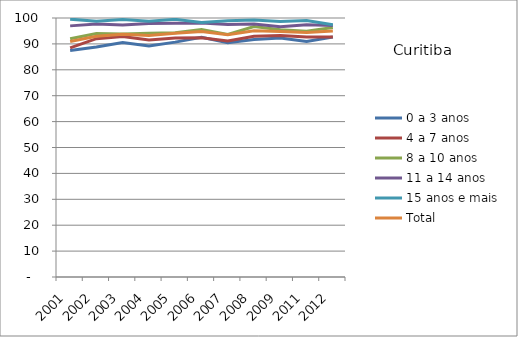
| Category | 0 a 3 anos | 4 a 7 anos | 8 a 10 anos | 11 a 14 anos | 15 anos e mais | Total |
|---|---|---|---|---|---|---|
| 2001.0 | 87.42 | 88.47 | 91.96 | 96.96 | 99.56 | 90.9 |
| 2002.0 | 88.79 | 92.01 | 94 | 97.66 | 98.78 | 92.96 |
| 2003.0 | 90.54 | 92.89 | 93.83 | 97.26 | 99.4 | 93.71 |
| 2004.0 | 89.18 | 91.54 | 94.08 | 97.84 | 98.73 | 93.23 |
| 2005.0 | 90.69 | 92.26 | 94.34 | 98.01 | 99.49 | 94.07 |
| 2006.0 | 92.59 | 92.41 | 95.57 | 98.07 | 98.26 | 94.83 |
| 2007.0 | 90.47 | 91.12 | 93.62 | 97.46 | 98.97 | 93.56 |
| 2008.0 | 91.74 | 92.98 | 96.67 | 97.72 | 99.19 | 95.04 |
| 2009.0 | 92.3 | 93.26 | 95.48 | 96.63 | 98.66 | 94.78 |
| 2011.0 | 90.92 | 92.65 | 94.86 | 97.39 | 99.02 | 94.4 |
| 2012.0 | 92.67 | 92.67 | 96.35 | 97.08 | 97.37 | 95.01 |